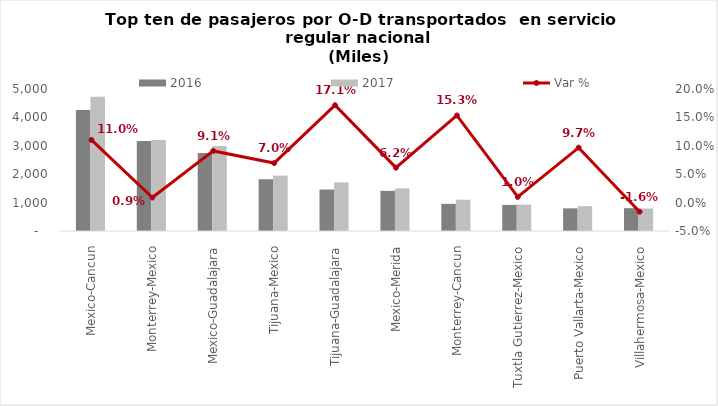
| Category | 2016 | 2017 |
|---|---|---|
| Mexico-Cancun | 4257 | 4726.604 |
| Monterrey-Mexico | 3173.395 | 3201.636 |
| Mexico-Guadalajara | 2745.166 | 2994.975 |
| Tijuana-Mexico | 1822.707 | 1949.537 |
| Tijuana-Guadalajara | 1460.117 | 1710.444 |
| Mexico-Merida | 1413.536 | 1500.472 |
| Monterrey-Cancun | 955.945 | 1102.594 |
| Tuxtla Gutierrez-Mexico | 919.457 | 928.638 |
| Puerto Vallarta-Mexico | 796.551 | 873.581 |
| Villahermosa-Mexico | 804.267 | 791.416 |